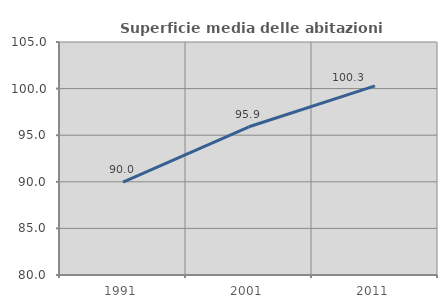
| Category | Superficie media delle abitazioni occupate |
|---|---|
| 1991.0 | 89.975 |
| 2001.0 | 95.905 |
| 2011.0 | 100.288 |